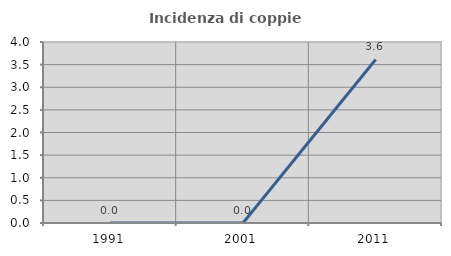
| Category | Incidenza di coppie miste |
|---|---|
| 1991.0 | 0 |
| 2001.0 | 0 |
| 2011.0 | 3.614 |